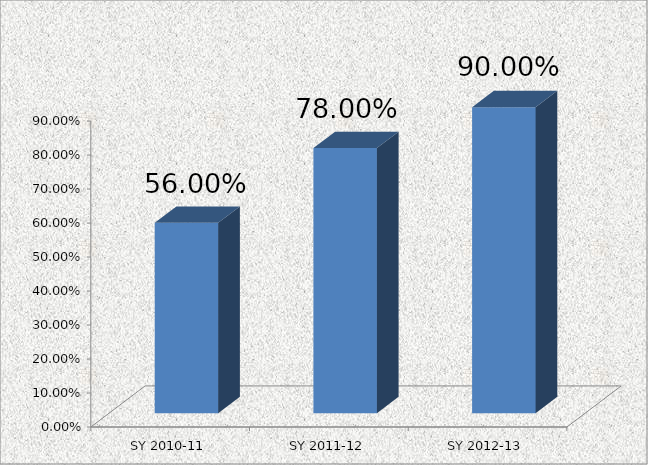
| Category | Series 0 |
|---|---|
| SY 2010-11 | 0.56 |
| SY 2011-12 | 0.78 |
| SY 2012-13 | 0.9 |